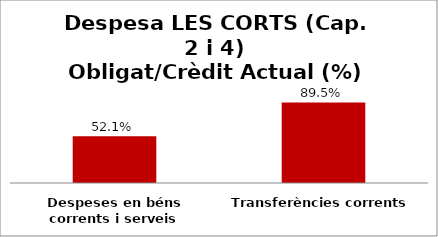
| Category | Series 0 |
|---|---|
| Despeses en béns corrents i serveis | 0.521 |
| Transferències corrents | 0.895 |